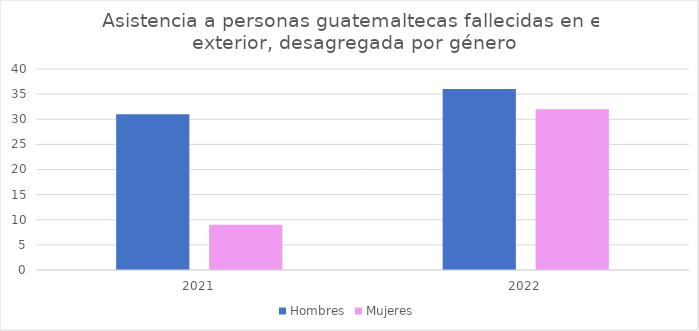
| Category | Hombres | Mujeres |
|---|---|---|
| 2021.0 | 31 | 9 |
| 2022.0 | 36 | 32 |